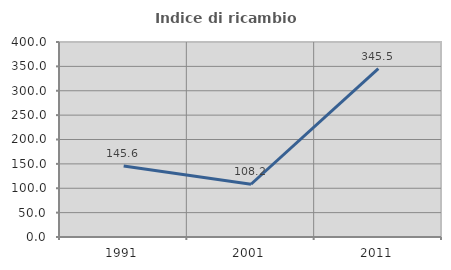
| Category | Indice di ricambio occupazionale  |
|---|---|
| 1991.0 | 145.614 |
| 2001.0 | 108.197 |
| 2011.0 | 345.455 |